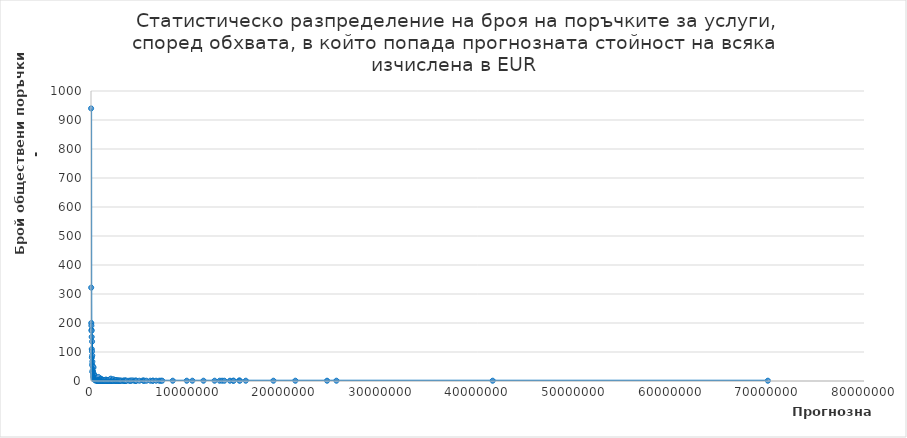
| Category | Series 0 |
|---|---|
| 10000.0 | 940 |
| 20000.0 | 322 |
| 30000.0 | 200 |
| 40000.0 | 191 |
| 50000.0 | 176 |
| 60000.0 | 173 |
| 70000.0 | 152 |
| 80000.0 | 110 |
| 90000.0 | 81 |
| 100000.0 | 102 |
| 110000.0 | 136 |
| 120000.0 | 57 |
| 130000.0 | 88 |
| 140000.0 | 67 |
| 150000.0 | 32 |
| 160000.0 | 52 |
| 170000.0 | 36 |
| 180000.0 | 30 |
| 190000.0 | 30 |
| 200000.0 | 33 |
| 210000.0 | 48 |
| 220000.0 | 20 |
| 230000.0 | 14 |
| 240000.0 | 25 |
| 250000.0 | 27 |
| 260000.0 | 47 |
| 270000.0 | 8 |
| 280000.0 | 13 |
| 290000.0 | 6 |
| 300000.0 | 8 |
| 310000.0 | 22 |
| 320000.0 | 9 |
| 330000.0 | 5 |
| 340000.0 | 11 |
| 350000.0 | 9 |
| 360000.0 | 9 |
| 370000.0 | 8 |
| 380000.0 | 8 |
| 390000.0 | 16 |
| 400000.0 | 5 |
| 410000.0 | 17 |
| 420000.0 | 16 |
| 430000.0 | 8 |
| 440000.0 | 5 |
| 450000.0 | 8 |
| 460000.0 | 2 |
| 470000.0 | 10 |
| 480000.0 | 2 |
| 490000.0 | 8 |
| 500000.0 | 8 |
| 510000.0 | 3 |
| 520000.0 | 11 |
| 530000.0 | 4 |
| 540000.0 | 9 |
| 550000.0 | 2 |
| 560000.0 | 4 |
| 570000.0 | 3 |
| 580000.0 | 3 |
| 590000.0 | 7 |
| 600000.0 | 3 |
| 620000.0 | 5 |
| 630000.0 | 2 |
| 640000.0 | 8 |
| 650000.0 | 1 |
| 660000.0 | 1 |
| 670000.0 | 4 |
| 680000.0 | 3 |
| 690000.0 | 3 |
| 700000.0 | 1 |
| 710000.0 | 4 |
| 720000.0 | 1 |
| 730000.0 | 2 |
| 740000.0 | 1 |
| 760000.0 | 3 |
| 770000.0 | 14 |
| 780000.0 | 1 |
| 790000.0 | 2 |
| 800000.0 | 1 |
| 820000.0 | 1 |
| 830000.0 | 4 |
| 840000.0 | 2 |
| 850000.0 | 3 |
| 860000.0 | 1 |
| 870000.0 | 2 |
| 880000.0 | 1 |
| 890000.0 | 2 |
| 900000.0 | 2 |
| 910000.0 | 1 |
| 930000.0 | 4 |
| 950000.0 | 1 |
| 970000.0 | 1 |
| 980000.0 | 5 |
| 990000.0 | 2 |
| 1000000.0 | 1 |
| 1020000.0 | 1 |
| 1030000.0 | 8 |
| 1040000.0 | 6 |
| 1070000.0 | 1 |
| 1080000.0 | 2 |
| 1090000.0 | 1 |
| 1110000.0 | 2 |
| 1130000.0 | 4 |
| 1140000.0 | 1 |
| 1160000.0 | 1 |
| 1180000.0 | 2 |
| 1200000.0 | 1 |
| 1210000.0 | 2 |
| 1230000.0 | 4 |
| 1250000.0 | 1 |
| 1260000.0 | 1 |
| 1270000.0 | 1 |
| 1280000.0 | 1 |
| 1300000.0 | 1 |
| 1330000.0 | 3 |
| 1360000.0 | 1 |
| 1370000.0 | 1 |
| 1390000.0 | 1 |
| 1440000.0 | 2 |
| 1460000.0 | 1 |
| 1480000.0 | 3 |
| 1500000.0 | 1 |
| 1540000.0 | 5 |
| 1580000.0 | 2 |
| 1630000.0 | 1 |
| 1640000.0 | 1 |
| 1650000.0 | 1 |
| 1670000.0 | 1 |
| 1680000.0 | 1 |
| 1690000.0 | 1 |
| 1720000.0 | 1 |
| 1740000.0 | 1 |
| 1780000.0 | 1 |
| 1810000.0 | 1 |
| 1830000.0 | 1 |
| 1850000.0 | 4 |
| 1880000.0 | 1 |
| 1920000.0 | 1 |
| 1980000.0 | 1 |
| 2020000.0 | 1 |
| 2030000.0 | 2 |
| 2050000.0 | 8 |
| 2100000.0 | 1 |
| 2150000.0 | 1 |
| 2160000.0 | 1 |
| 2170000.0 | 1 |
| 2190000.0 | 1 |
| 2200000.0 | 2 |
| 2210000.0 | 1 |
| 2250000.0 | 1 |
| 2300000.0 | 1 |
| 2310000.0 | 6 |
| 2430000.0 | 1 |
| 2500000.0 | 1 |
| 2540000.0 | 1 |
| 2560000.0 | 3 |
| 2580000.0 | 1 |
| 2600000.0 | 1 |
| 2610000.0 | 1 |
| 2660000.0 | 3 |
| 2770000.0 | 1 |
| 2820000.0 | 1 |
| 2830000.0 | 1 |
| 2870000.0 | 1 |
| 2920000.0 | 1 |
| 2970000.0 | 1 |
| 3010000.0 | 1 |
| 3070000.0 | 1 |
| 3160000.0 | 1 |
| 3330000.0 | 1 |
| 3380000.0 | 1 |
| 3440000.0 | 1 |
| 3510000.0 | 1 |
| 3560000.0 | 1 |
| 3570000.0 | 1 |
| 3580000.0 | 1 |
| 3690000.0 | 1 |
| 3950000.0 | 1 |
| 4090000.0 | 1 |
| 4100000.0 | 1 |
| 4280000.0 | 2 |
| 4480000.0 | 1 |
| 4610000.0 | 1 |
| 4650000.0 | 1 |
| 4690000.0 | 1 |
| 5010000.0 | 1 |
| 5370000.0 | 2 |
| 5450000.0 | 1 |
| 5530000.0 | 1 |
| 5740000.0 | 1 |
| 6140000.0 | 1 |
| 6400000.0 | 1 |
| 6410000.0 | 1 |
| 6740000.0 | 1 |
| 7070000.0 | 1 |
| 7230000.0 | 1 |
| 7370000.0 | 1 |
| 8460000.0 | 1 |
| 9910000.0 | 1 |
| 10490000.0 | 1 |
| 11640000.0 | 1 |
| 12790000.0 | 1 |
| 13320000.0 | 1 |
| 13570000.0 | 1 |
| 13800000.0 | 1 |
| 14380000.0 | 1 |
| 14710000.0 | 1 |
| 14770000.0 | 1 |
| 15340000.0 | 2 |
| 15410000.0 | 1 |
| 16020000.0 | 1 |
| 18880000.0 | 1 |
| 21150000.0 | 1 |
| 24430000.0 | 1 |
| 25400000.0 | 1 |
| 41570000.0 | 1 |
| 70050000.0 | 1 |